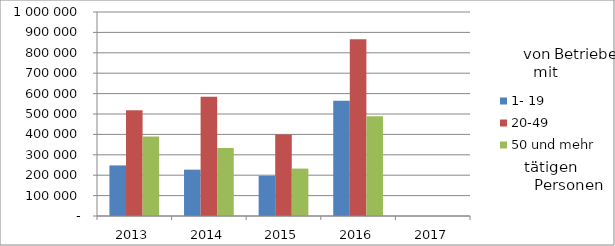
| Category | 1- 19 | 20-49 | 50 und mehr |
|---|---|---|---|
| 2013.0 | 247934.383 | 518337.491 | 390032.948 |
| 2014.0 | 227132.521 | 584877.621 | 332909.543 |
| 2015.0 | 196941.16 | 399161.973 | 232434.682 |
| 2016.0 | 564927.004 | 866402.513 | 488953.198 |
| 2017.0 | 0 | 0 | 0 |